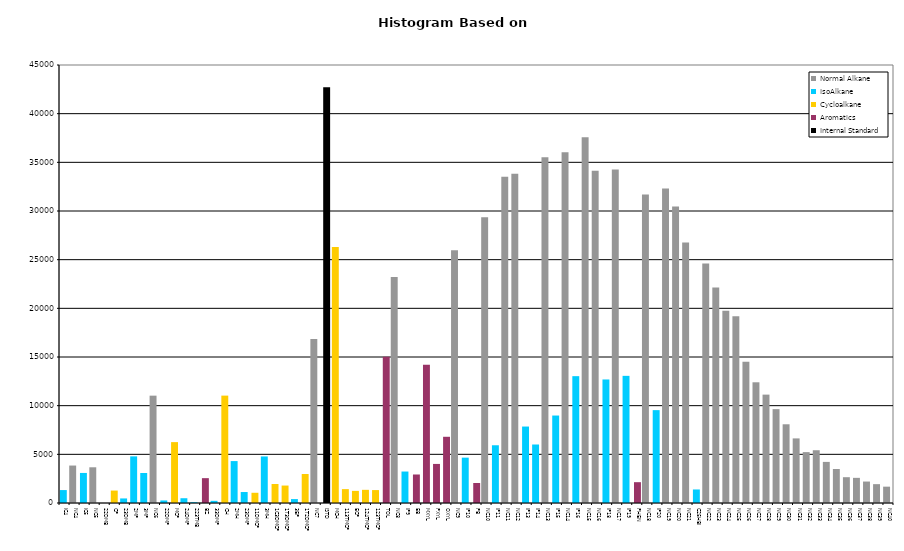
| Category | Normal Alkane | IsoAlkane | Cycloalkane | Aromatics | Internal Standard |
|---|---|---|---|---|---|
| IC4 | 0 | 1329 | 0 | 0 | 0 |
| NC4 | 3848 | 0 | 0 | 0 | 0 |
| IC5 | 0 | 3088 | 0 | 0 | 0 |
| NC5 | 3669 | 0 | 0 | 0 | 0 |
| 22DMB | 0 | 0 | 0 | 0 | 0 |
| CP | 0 | 0 | 1278 | 0 | 0 |
| 23DMB | 0 | 469 | 0 | 0 | 0 |
| 2MP | 0 | 4791 | 0 | 0 | 0 |
| 3MP | 0 | 3085 | 0 | 0 | 0 |
| NC6 | 11028 | 0 | 0 | 0 | 0 |
| 22DMP | 0 | 262 | 0 | 0 | 0 |
| MCP | 0 | 0 | 6255 | 0 | 0 |
| 24DMP | 0 | 490 | 0 | 0 | 0 |
| 223TMB | 0 | 82 | 0 | 0 | 0 |
| BZ | 0 | 0 | 0 | 2553 | 0 |
| 33DMP | 0 | 223 | 0 | 0 | 0 |
| CH | 0 | 0 | 11033 | 0 | 0 |
| 2MH | 0 | 4307 | 0 | 0 | 0 |
| 23DMP | 0 | 1127 | 0 | 0 | 0 |
| 11DMCP | 0 | 0 | 1050 | 0 | 0 |
| 3MH | 0 | 4783 | 0 | 0 | 0 |
| 1C3DMCP | 0 | 0 | 1952 | 0 | 0 |
| 1T3DMCP | 0 | 0 | 1793 | 0 | 0 |
| 3EP | 0 | 402 | 0 | 0 | 0 |
| 1T2DMCP | 0 | 0 | 2977 | 0 | 0 |
| NC7 | 16838 | 0 | 0 | 0 | 0 |
| ISTD | 0 | 0 | 0 | 0 | 42705 |
| MCH | 0 | 0 | 26303 | 0 | 0 |
| 113TMCP | 0 | 0 | 1425 | 0 | 0 |
| ECP | 0 | 0 | 1245 | 0 | 0 |
| 124TMCP | 0 | 0 | 1353 | 0 | 0 |
| 123TMCP | 0 | 0 | 1328 | 0 | 0 |
| TOL | 0 | 0 | 0 | 15033 | 0 |
| NC8 | 23231 | 0 | 0 | 0 | 0 |
| IP9 | 0 | 3233 | 0 | 0 | 0 |
| EB | 0 | 0 | 0 | 2929 | 0 |
| MXYL | 0 | 0 | 0 | 14209 | 0 |
| PXYL | 0 | 0 | 0 | 4014 | 0 |
| OXYL | 0 | 0 | 0 | 6803 | 0 |
| NC9 | 25960 | 0 | 0 | 0 | 0 |
| IP10 | 0 | 4659 | 0 | 0 | 0 |
| PB | 0 | 0 | 0 | 2057 | 0 |
| NC10 | 29370 | 0 | 0 | 0 | 0 |
| IP11 | 0 | 5932 | 0 | 0 | 0 |
| NC11 | 33514 | 0 | 0 | 0 | 0 |
| NC12 | 33836 | 0 | 0 | 0 | 0 |
| IP13 | 0 | 7855 | 0 | 0 | 0 |
| IP14 | 0 | 6010 | 0 | 0 | 0 |
| NC13 | 35526 | 0 | 0 | 0 | 0 |
| IP15 | 0 | 8986 | 0 | 0 | 0 |
| NC14 | 36037 | 0 | 0 | 0 | 0 |
| IP16 | 0 | 13032 | 0 | 0 | 0 |
| NC15 | 37584 | 0 | 0 | 0 | 0 |
| NC16 | 34141 | 0 | 0 | 0 | 0 |
| IP18 | 0 | 12691 | 0 | 0 | 0 |
| NC17 | 34276 | 0 | 0 | 0 | 0 |
| IP19 | 0 | 13063 | 0 | 0 | 0 |
| PHEN | 0 | 0 | 0 | 2139 | 0 |
| NC18 | 31707 | 0 | 0 | 0 | 0 |
| IP20 | 0 | 9541 | 0 | 0 | 0 |
| NC19 | 32314 | 0 | 0 | 0 | 0 |
| NC20 | 30472 | 0 | 0 | 0 | 0 |
| NC21 | 26755 | 0 | 0 | 0 | 0 |
| C25HBI | 0 | 1390 | 0 | 0 | 0 |
| NC22 | 24601 | 0 | 0 | 0 | 0 |
| NC23 | 22151 | 0 | 0 | 0 | 0 |
| NC24 | 19758 | 0 | 0 | 0 | 0 |
| NC25 | 19178 | 0 | 0 | 0 | 0 |
| NC26 | 14512 | 0 | 0 | 0 | 0 |
| NC27 | 12402 | 0 | 0 | 0 | 0 |
| NC28 | 11135 | 0 | 0 | 0 | 0 |
| NC29 | 9643 | 0 | 0 | 0 | 0 |
| NC30 | 8088 | 0 | 0 | 0 | 0 |
| NC31 | 6637 | 0 | 0 | 0 | 0 |
| NC32 | 5227 | 0 | 0 | 0 | 0 |
| NC33 | 5421 | 0 | 0 | 0 | 0 |
| NC34 | 4223 | 0 | 0 | 0 | 0 |
| NC35 | 3491 | 0 | 0 | 0 | 0 |
| NC36 | 2651 | 0 | 0 | 0 | 0 |
| NC37 | 2584 | 0 | 0 | 0 | 0 |
| NC38 | 2205 | 0 | 0 | 0 | 0 |
| NC39 | 1936 | 0 | 0 | 0 | 0 |
| NC40 | 1679 | 0 | 0 | 0 | 0 |